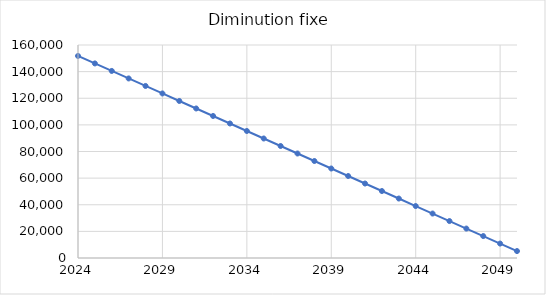
| Category | Diminution fixe |
|---|---|
| 2024.0 | 151788 |
| 2025.0 | 146150 |
| 2026.0 | 140512 |
| 2027.0 | 134874 |
| 2028.0 | 129236 |
| 2029.0 | 123598 |
| 2030.0 | 117960 |
| 2031.0 | 112322 |
| 2032.0 | 106684 |
| 2033.0 | 101046 |
| 2034.0 | 95408 |
| 2035.0 | 89770 |
| 2036.0 | 84132 |
| 2037.0 | 78494 |
| 2038.0 | 72856 |
| 2039.0 | 67218 |
| 2040.0 | 61580 |
| 2041.0 | 55942 |
| 2042.0 | 50304 |
| 2043.0 | 44666 |
| 2044.0 | 39028 |
| 2045.0 | 33390 |
| 2046.0 | 27752 |
| 2047.0 | 22114 |
| 2048.0 | 16476 |
| 2049.0 | 10838 |
| 2050.0 | 5200 |